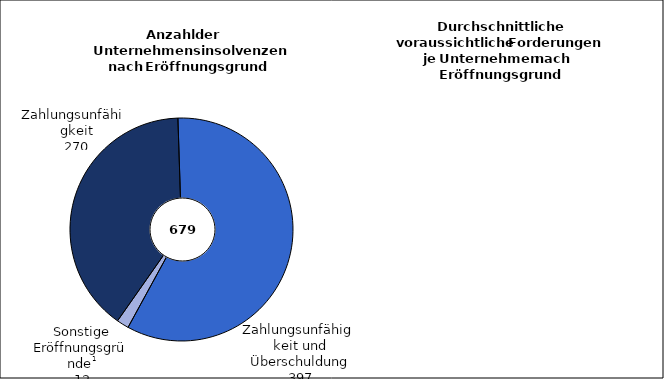
| Category | Series 0 | Series 1 |
|---|---|---|
| Zahlungsunfähigkeit | 270 | 243 |
|   Zahlungsunfähigkeit
   und Überschuldung | 397 | 1890 |
|  Sonstige Eröffnungs-
                      gründe 2 | 12 | 3693 |